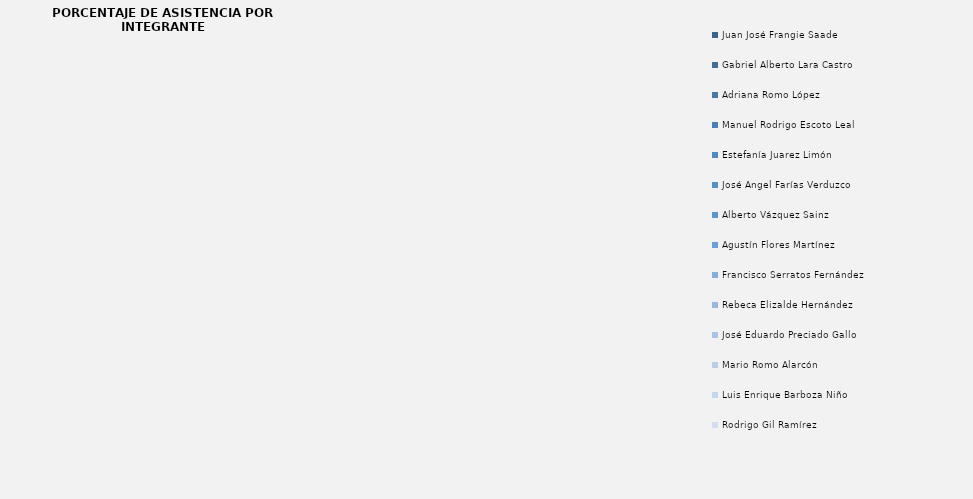
| Category | Series 0 |
|---|---|
| Juan José Frangie Saade | 0 |
| Gabriel Alberto Lara Castro | 0 |
| Adriana Romo López | 0 |
| Manuel Rodrigo Escoto Leal | 0 |
| Estefanía Juarez Limón | 0 |
| José Ángel Farías Verduzco  | 0 |
| Alberto Vázquez Sainz | 0 |
| Agustín Flores Martínez | 0 |
| Francisco Serratos Fernández | 0 |
| Rebeca Elizalde Hernández | 0 |
| José Eduardo Preciado Gallo | 0 |
| Mario Romo Alarcón | 0 |
| Luis Enrique Barboza Niño | 0 |
| Rodrigo Gil Ramírez | 0 |